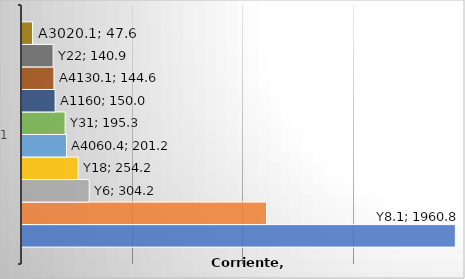
| Category | Y8.1 | Y35 | Y6 | Y18 | A4060.4 | Y31 | A1160 | A4130.1 | Y22 | A3020.1 |
|---|---|---|---|---|---|---|---|---|---|---|
| 0 | 1960.76 | 1106.515 | 304.224 | 254.224 | 201.245 | 195.265 | 150.013 | 144.562 | 140.89 | 47.626 |